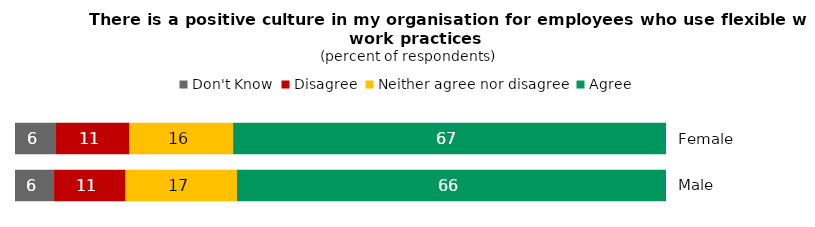
| Category | Don't Know | Disagree | Neither agree nor disagree | Agree |
|---|---|---|---|---|
| Female | 6.3 | 11.3 | 15.9 | 66.5 |
| Male | 6 | 11 | 17.1 | 65.9 |